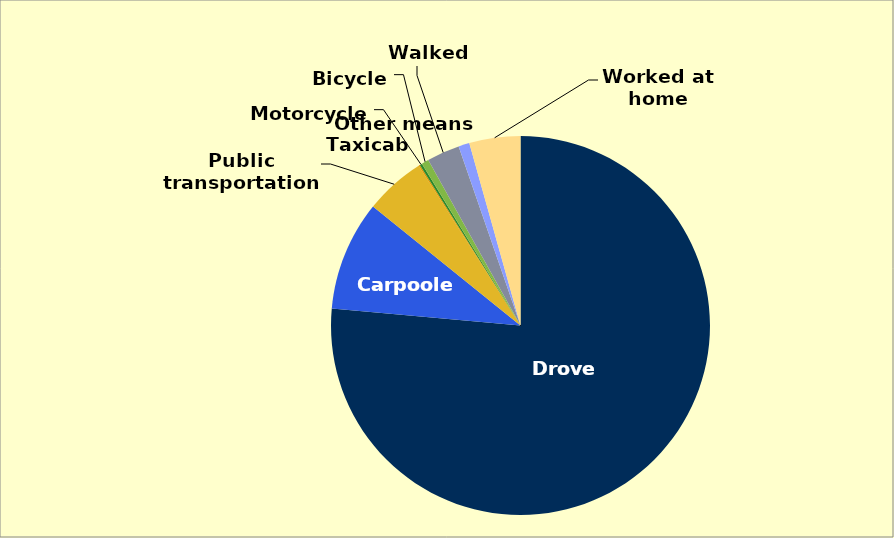
| Category | Series 0 |
|---|---|
| Drove alone | 109277215 |
| Carpooled | 13387020 |
| Public transportation | 7393159 |
| Taxicab | 160975 |
| Motorcycle | 295733 |
| Bicycle | 882198 |
| Walked | 4000459 |
| Other means | 1336608 |
| Worked at home | 6229012 |